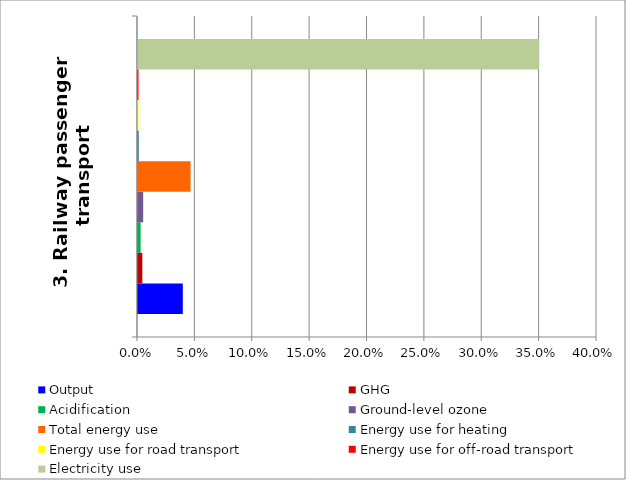
| Category | Output | GHG | Acidification | Ground-level ozone | Total energy use | Energy use for heating | Energy use for road transport | Energy use for off-road transport | Electricity use |
|---|---|---|---|---|---|---|---|---|---|
| 3. Railway passenger transport | 0.039 | 0.004 | 0.002 | 0.005 | 0.046 | 0.001 | 0 | 0 | 0.349 |